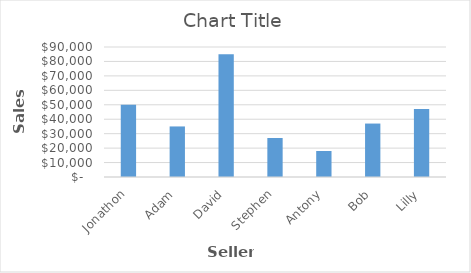
| Category | Series 0 |
|---|---|
| Jonathon | 50000 |
| Adam | 35000 |
| David | 85000 |
| Stephen | 27000 |
| Antony | 18000 |
| Bob | 37000 |
| Lilly | 47000 |